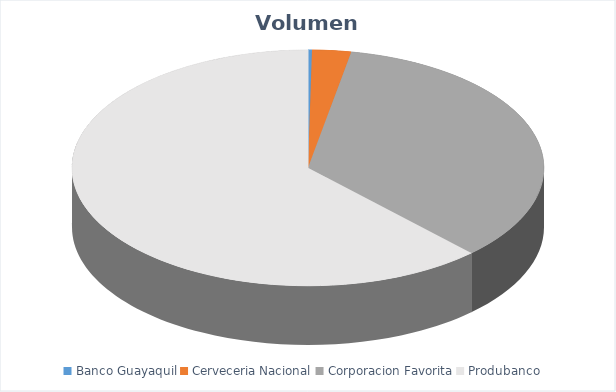
| Category | VOLUMEN ($USD) |
|---|---|
| Banco Guayaquil | 960 |
| Cerveceria Nacional | 9500 |
| Corporacion Favorita | 124559.49 |
| Produbanco | 221784.45 |